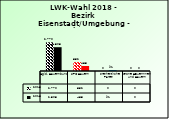
| Category | 2013 | 2018 |
|---|---|---|
| Bgld. Bauernbund | 2770 | 2303 |
| SPÖ Bauern | 852 | 483 |
| Freiheitliche Partei | 0 | 91 |
| Grüne Bäuerinnen und Bauern | 0 | 0 |